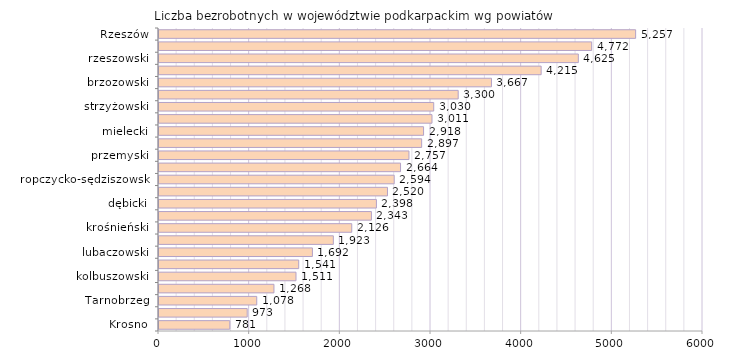
| Category | Liczba bezrobotnych w województwie podkarpackim wg powiatów |
|---|---|
| Krosno | 781 |
| bieszczadzki | 973 |
| Tarnobrzeg | 1078 |
| tarnobrzeski  | 1268 |
| kolbuszowski | 1511 |
| leski | 1541 |
| lubaczowski | 1692 |
| stalowowolski | 1923 |
| krośnieński | 2126 |
| Przemyśl | 2343 |
| dębicki | 2398 |
| łańcucki | 2520 |
| ropczycko-sędziszowski | 2594 |
| sanocki | 2664 |
| przemyski | 2757 |
| leżajski | 2897 |
| mielecki | 2918 |
| niżański | 3011 |
| strzyżowski | 3030 |
| przeworski | 3300 |
| brzozowski | 3667 |
| jarosławski | 4215 |
| rzeszowski | 4625 |
| jasielski | 4772 |
| Rzeszów | 5257 |